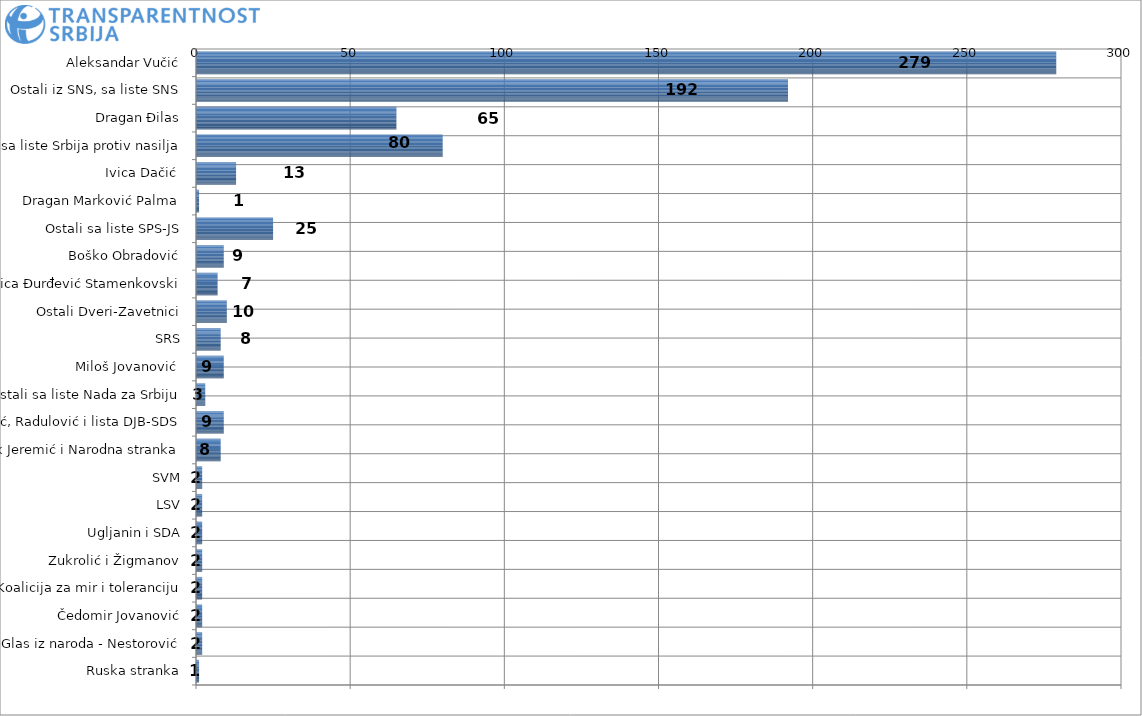
| Category | Series 0 |
|---|---|
| Aleksandar Vučić | 279 |
| Ostali iz SNS, sa liste SNS | 192 |
| Dragan Đilas | 65 |
| Ostali sa liste Srbija protiv nasilja | 80 |
| Ivica Dačić  | 13 |
| Dragan Marković Palma | 1 |
| Ostali sa liste SPS-JS | 25 |
| Boško Obradović | 9 |
| Milica Đurđević Stamenkovski | 7 |
| Ostali Dveri-Zavetnici | 10 |
| SRS | 8 |
| Miloš Jovanović  | 9 |
| Ostali sa liste Nada za Srbiju | 3 |
| Tadić, Radulović i lista DJB-SDS | 9 |
| Vuk Jeremić i Narodna stranka | 8 |
| SVM | 2 |
| LSV | 2 |
| Ugljanin i SDA | 2 |
| Zukrolić i Žigmanov | 2 |
| Lista Koalicija za mir i toleranciju | 2 |
| Čedomir Jovanović | 2 |
| Glas iz naroda - Nestorović | 2 |
| Ruska stranka | 1 |